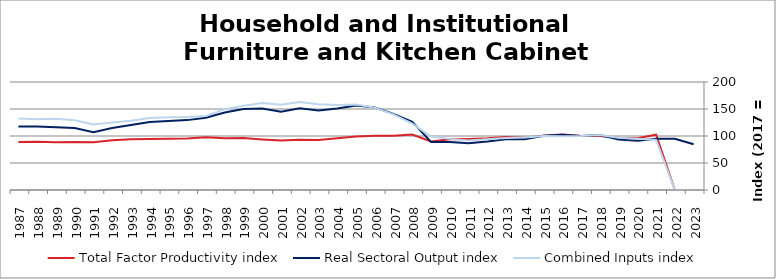
| Category | Total Factor Productivity index | Real Sectoral Output index | Combined Inputs index |
|---|---|---|---|
| 2023.0 | 0 | 84.635 | 0 |
| 2022.0 | 0 | 94.885 | 0 |
| 2021.0 | 102.292 | 94.985 | 92.857 |
| 2020.0 | 95.897 | 91.185 | 95.086 |
| 2019.0 | 96.556 | 93.378 | 96.709 |
| 2018.0 | 100.057 | 101.9 | 101.842 |
| 2017.0 | 100 | 100 | 100 |
| 2016.0 | 102.766 | 102.352 | 99.597 |
| 2015.0 | 100.662 | 100.596 | 99.935 |
| 2014.0 | 96.765 | 93.981 | 97.124 |
| 2013.0 | 97.963 | 94.165 | 96.123 |
| 2012.0 | 95.612 | 89.94 | 94.068 |
| 2011.0 | 94.475 | 86.514 | 91.573 |
| 2010.0 | 93.884 | 88.89 | 94.681 |
| 2009.0 | 89.768 | 88.904 | 99.037 |
| 2008.0 | 102.637 | 126.126 | 122.885 |
| 2007.0 | 100.632 | 141.004 | 140.119 |
| 2006.0 | 100.38 | 152.81 | 152.232 |
| 2005.0 | 98.867 | 156.387 | 158.179 |
| 2004.0 | 95.743 | 150.753 | 157.455 |
| 2003.0 | 92.62 | 147.124 | 158.847 |
| 2002.0 | 92.92 | 151.315 | 162.845 |
| 2001.0 | 91.721 | 144.887 | 157.965 |
| 2000.0 | 93.717 | 150.77 | 160.879 |
| 1999.0 | 96.28 | 150.134 | 155.934 |
| 1998.0 | 95.932 | 143.632 | 149.722 |
| 1997.0 | 97.585 | 133.917 | 137.231 |
| 1996.0 | 95.567 | 129.411 | 135.414 |
| 1995.0 | 94.85 | 127.618 | 134.548 |
| 1994.0 | 94.372 | 125.923 | 133.433 |
| 1993.0 | 94.101 | 120.546 | 128.103 |
| 1992.0 | 92.139 | 114.991 | 124.802 |
| 1991.0 | 88.229 | 107.063 | 121.347 |
| 1990.0 | 88.88 | 114.699 | 129.05 |
| 1989.0 | 88.261 | 116.354 | 131.83 |
| 1988.0 | 89.479 | 117.415 | 131.221 |
| 1987.0 | 89.032 | 117.789 | 132.3 |